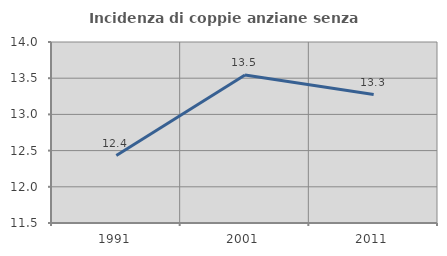
| Category | Incidenza di coppie anziane senza figli  |
|---|---|
| 1991.0 | 12.431 |
| 2001.0 | 13.545 |
| 2011.0 | 13.274 |